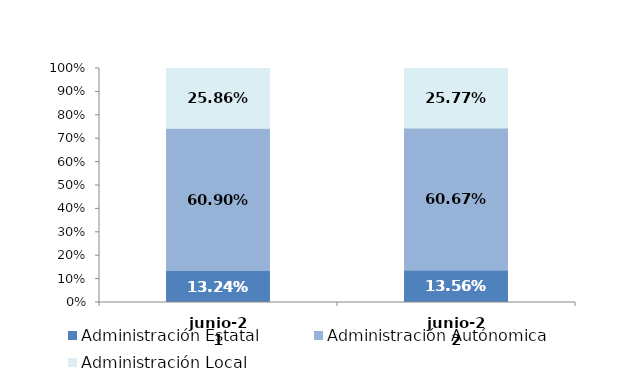
| Category | Administración Estatal | Administración Autónomica | Administración Local |
|---|---|---|---|
| 2021-06-01 | 0.132 | 0.609 | 0.259 |
| 2022-06-01 | 0.136 | 0.607 | 0.258 |